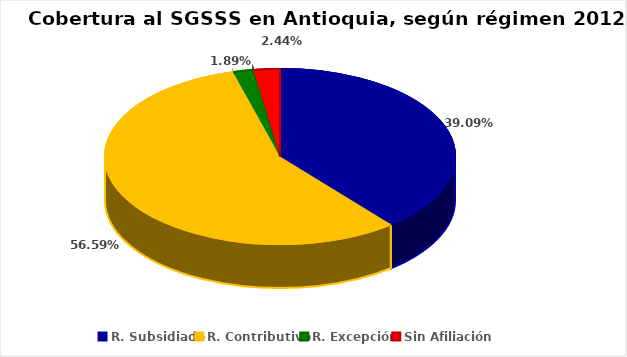
| Category | Series 0 |
|---|---|
| R. Subsidiado | 0.391 |
| R. Contributivo | 0.566 |
| R. Excepción | 0.019 |
| Sin Afiliación | 0.024 |